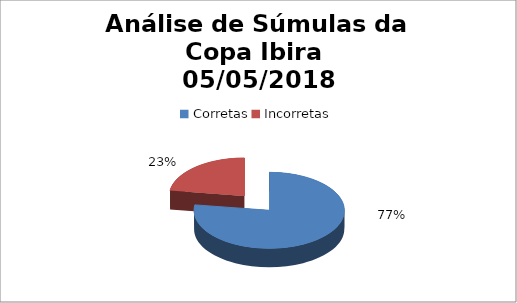
| Category | Series 0 |
|---|---|
| Corretas | 51 |
| Incorretas | 15 |